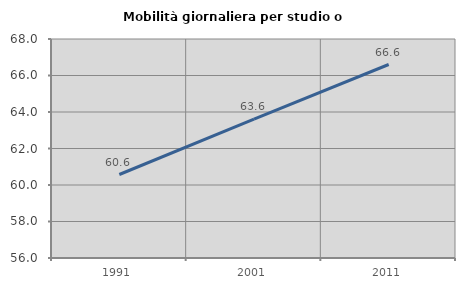
| Category | Mobilità giornaliera per studio o lavoro |
|---|---|
| 1991.0 | 60.575 |
| 2001.0 | 63.605 |
| 2011.0 | 66.603 |